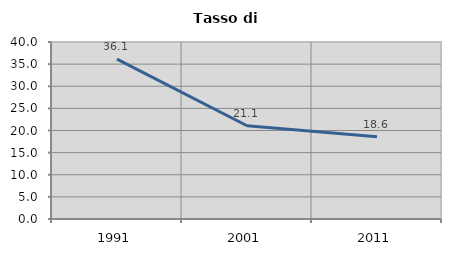
| Category | Tasso di disoccupazione   |
|---|---|
| 1991.0 | 36.137 |
| 2001.0 | 21.081 |
| 2011.0 | 18.593 |